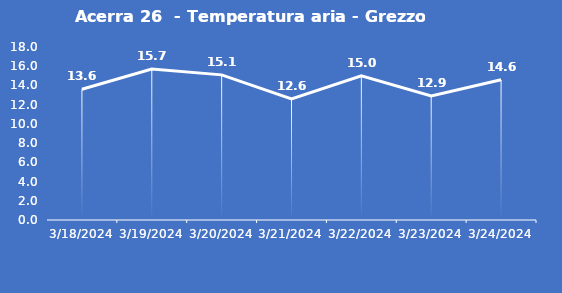
| Category | Acerra 26  - Temperatura aria - Grezzo (°C) |
|---|---|
| 3/18/24 | 13.6 |
| 3/19/24 | 15.7 |
| 3/20/24 | 15.1 |
| 3/21/24 | 12.6 |
| 3/22/24 | 15 |
| 3/23/24 | 12.9 |
| 3/24/24 | 14.6 |